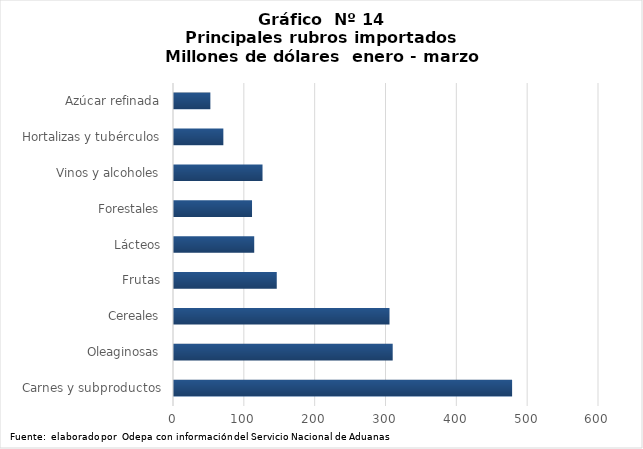
| Category | Series 0 |
|---|---|
| Carnes y subproductos | 477325.513 |
| Oleaginosas | 308757.302 |
| Cereales | 304248.568 |
| Frutas | 145073.754 |
| Lácteos | 113257.344 |
| Forestales | 110154 |
| Vinos y alcoholes | 124969.403 |
| Hortalizas y tubérculos | 69668.206 |
| Azúcar refinada | 51342.683 |